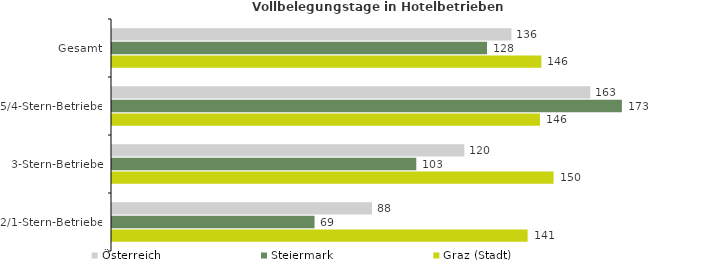
| Category | Österreich | Steiermark | Graz (Stadt) |
|---|---|---|---|
| Gesamt | 135.866 | 127.561 | 146.039 |
| 5/4-Stern-Betriebe | 162.683 | 173.435 | 145.592 |
| 3-Stern-Betriebe | 119.851 | 103.499 | 150.209 |
| 2/1-Stern-Betriebe | 88.435 | 68.894 | 141.371 |